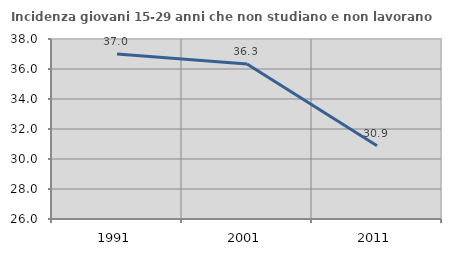
| Category | Incidenza giovani 15-29 anni che non studiano e non lavorano  |
|---|---|
| 1991.0 | 37 |
| 2001.0 | 36.332 |
| 2011.0 | 30.888 |